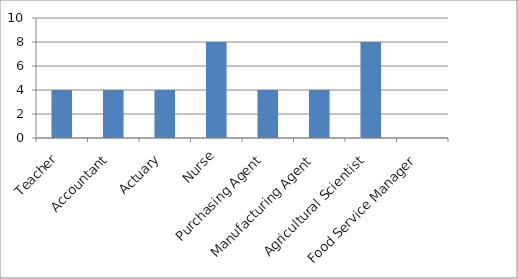
| Category | Series 0 |
|---|---|
| Teacher | 4 |
| Accountant | 4 |
| Actuary | 4 |
| Nurse | 8 |
| Purchasing Agent | 4 |
| Manufacturing Agent | 4 |
| Agricultural Scientist | 8 |
| Food Service Manager | 0 |